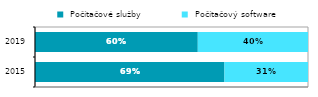
| Category |  Počítačové služby |  Počítačový software |
|---|---|---|
| 2015.0 | 0.694 | 0.306 |
| 2019.0 | 0.596 | 0.404 |